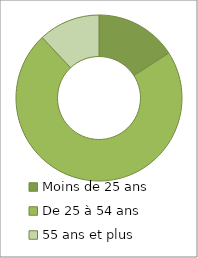
| Category | Series 0 |
|---|---|
| Moins de 25 ans | 0.159 |
| De 25 à 54 ans | 0.721 |
| 55 ans et plus | 0.12 |